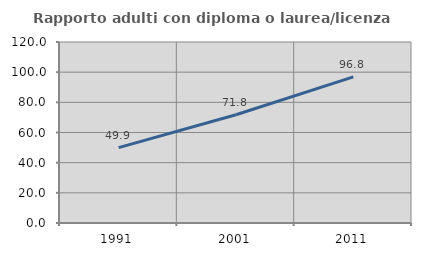
| Category | Rapporto adulti con diploma o laurea/licenza media  |
|---|---|
| 1991.0 | 49.943 |
| 2001.0 | 71.801 |
| 2011.0 | 96.831 |